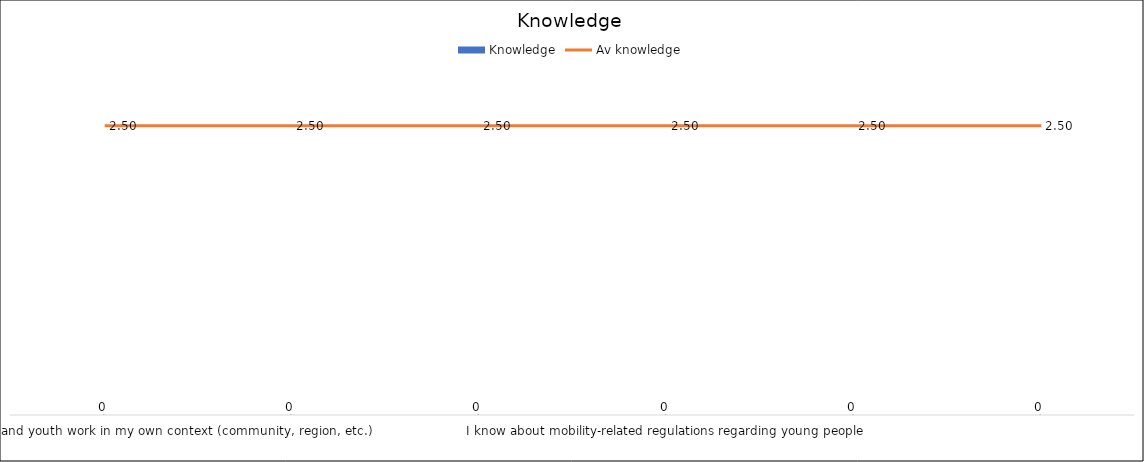
| Category | Knowledge |
|---|---|
| I know about youth policy and youth work in my own context (community, region, etc.) | 0 |
| I know of the socio-economic background of the young people  | 0 |
| I know about youth rights | 0 |
| I know about mobility-related regulations regarding young people | 0 |
| I know about media and promotion mechanisms with regard to youth work, including digital tools for networking and collaboration | 0 |
| I know of advocacy approaches and methods in a youth work context  | 0 |